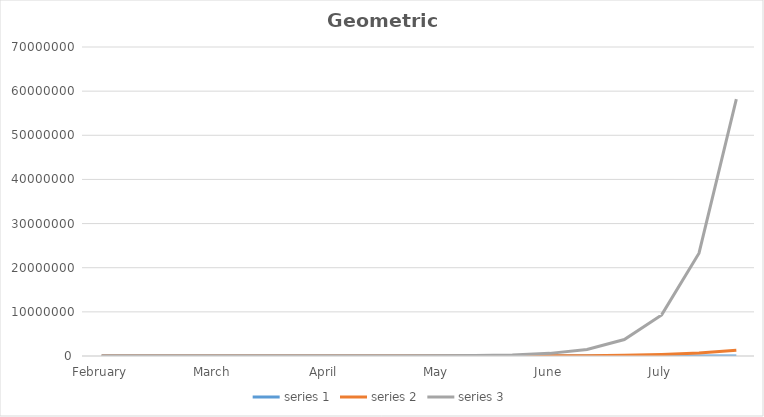
| Category | series 1 | series 2 | series 3 |
|---|---|---|---|
| February | 10 | 10 | 10 |
|  | 15 | 20 | 25 |
|  | 22.5 | 40 | 62.5 |
| March | 33.75 | 80 | 156.25 |
|  | 50.625 | 160 | 390.625 |
|  | 75.938 | 320 | 976.562 |
| April | 113.906 | 640 | 2441.406 |
|  | 170.859 | 1280 | 6103.516 |
|  | 256.289 | 2560 | 15258.789 |
| May | 384.434 | 5120 | 38146.973 |
|  | 576.65 | 10240 | 95367.432 |
|  | 864.976 | 20480 | 238418.579 |
| June | 1297.463 | 40960 | 596046.448 |
|  | 1946.195 | 81920 | 1490116.119 |
|  | 2919.293 | 163840 | 3725290.298 |
| July | 4378.939 | 327680 | 9313225.746 |